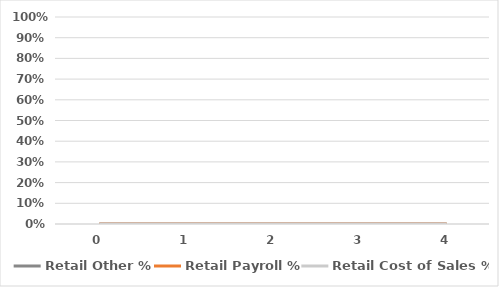
| Category | Retail Other % | Retail Payroll % | Retail Cost of Sales % |
|---|---|---|---|
| 0.0 | 0 | 0 | 0 |
| 1.0 | 0 | 0 | 0 |
| 2.0 | 0 | 0 | 0 |
| 3.0 | 0 | 0 | 0 |
| 4.0 | 0 | 0 | 0 |